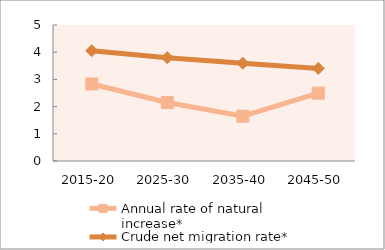
| Category | Annual rate of natural increase* | Crude net migration rate* |
|---|---|---|
| 2015-20 | 2.831 | 4.055 |
| 2025-30 | 2.15 | 3.797 |
| 2035-40 | 1.646 | 3.597 |
| 2045-50 | 2.494 | 3.401 |